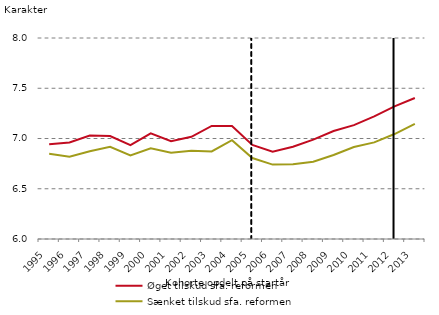
| Category | Øget tilskud sfa. reformen | Sænket tilskud sfa. reformen |
|---|---|---|
| 1995.0 | 6.942 | 6.849 |
| 1996.0 | 6.961 | 6.82 |
| 1997.0 | 7.029 | 6.872 |
| 1998.0 | 7.025 | 6.918 |
| 1999.0 | 6.934 | 6.832 |
| 2000.0 | 7.052 | 6.903 |
| 2001.0 | 6.972 | 6.859 |
| 2002.0 | 7.017 | 6.879 |
| 2003.0 | 7.125 | 6.871 |
| 2004.0 | 7.125 | 6.983 |
| 2005.0 | 6.936 | 6.805 |
| 2006.0 | 6.869 | 6.74 |
| 2007.0 | 6.918 | 6.744 |
| 2008.0 | 6.989 | 6.768 |
| 2009.0 | 7.074 | 6.836 |
| 2010.0 | 7.133 | 6.915 |
| 2011.0 | 7.22 | 6.961 |
| 2012.0 | 7.32 | 7.044 |
| 2013.0 | 7.403 | 7.146 |